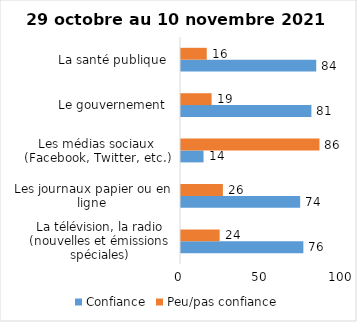
| Category | Confiance | Peu/pas confiance |
|---|---|---|
| La télévision, la radio (nouvelles et émissions spéciales) | 76 | 24 |
| Les journaux papier ou en ligne | 74 | 26 |
| Les médias sociaux (Facebook, Twitter, etc.) | 14 | 86 |
| Le gouvernement  | 81 | 19 |
| La santé publique  | 84 | 16 |